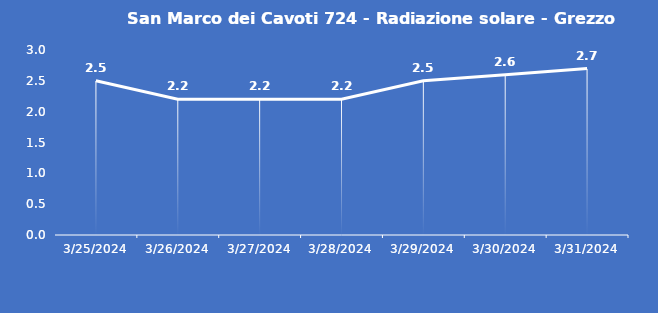
| Category | San Marco dei Cavoti 724 - Radiazione solare - Grezzo (W/m2) |
|---|---|
| 3/25/24 | 2.5 |
| 3/26/24 | 2.2 |
| 3/27/24 | 2.2 |
| 3/28/24 | 2.2 |
| 3/29/24 | 2.5 |
| 3/30/24 | 2.6 |
| 3/31/24 | 2.7 |